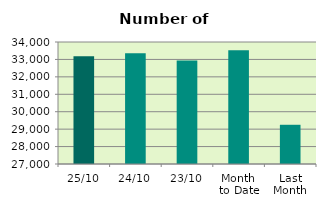
| Category | Series 0 |
|---|---|
| 25/10 | 33182 |
| 24/10 | 33352 |
| 23/10 | 32942 |
| Month 
to Date | 33529.263 |
| Last
Month | 29250.6 |